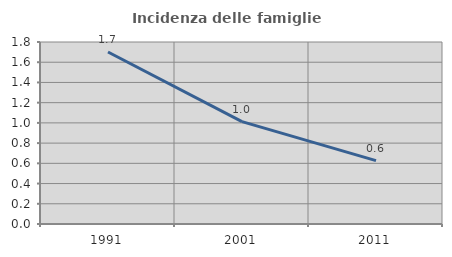
| Category | Incidenza delle famiglie numerose |
|---|---|
| 1991.0 | 1.701 |
| 2001.0 | 1.012 |
| 2011.0 | 0.626 |